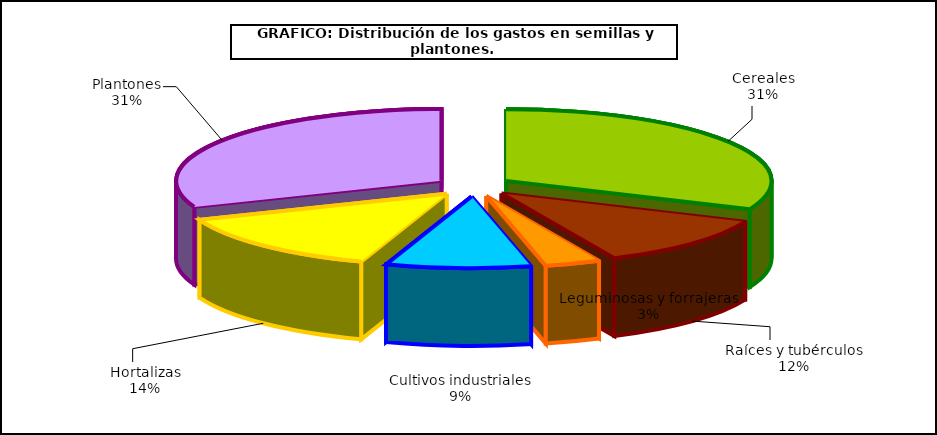
| Category | Series 0 |
|---|---|
| 0 | 306.431 |
| 1 | 112.125 |
| 2 | 32.935 |
| 3 | 85.798 |
| 4 | 134.642 |
| 5 | 301.063 |